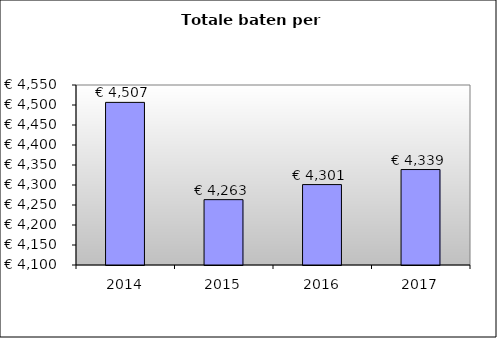
| Category | Series 0 |
|---|---|
| 2014.0 | 4506.539 |
| 2015.0 | 4263.397 |
| 2016.0 | 4301.027 |
| 2017.0 | 4338.657 |